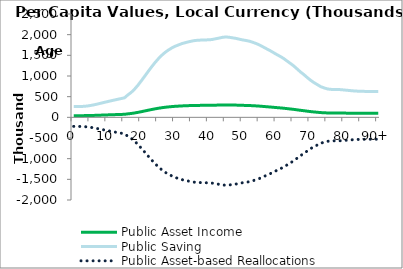
| Category | Public Asset Income | Public Saving | Public Asset-based Reallocations |
|---|---|---|---|
| 0 | 40148.06 | 259153.352 | -219005.292 |
|  | 40381.777 | 260661.978 | -220280.201 |
| 2 | 40615.493 | 262170.604 | -221555.111 |
| 3 | 41235.617 | 266173.47 | -224937.852 |
| 4 | 42460.541 | 274080.281 | -231619.74 |
| 5 | 44397.2 | 286581.298 | -242184.098 |
| 6 | 46856.028 | 302452.888 | -255596.86 |
| 7 | 49771.188 | 321270.069 | -271498.882 |
| 8 | 52848.296 | 341132.62 | -288284.324 |
| 9 | 55918.351 | 360949.647 | -305031.296 |
| 10 | 58954.067 | 380545.015 | -321590.948 |
| 11 | 61922.236 | 399704.368 | -337782.132 |
| 12 | 64754.889 | 417988.976 | -353234.087 |
| 13 | 67562.383 | 436111.181 | -368548.798 |
| 14 | 70315.509 | 453882.452 | -383566.942 |
| 15 | 73070.725 | 471667.203 | -398596.479 |
| 16 | 84000.107 | 542215.717 | -458215.611 |
| 17 | 93523.48 | 603688.526 | -510165.046 |
| 18 | 105770.193 | 682740.338 | -576970.145 |
| 19 | 120614.885 | 778561.942 | -657947.057 |
| 20 | 137241.334 | 885884.685 | -748643.352 |
| 21 | 154357.834 | 996370.68 | -842012.846 |
| 22 | 171777.245 | 1108811.947 | -937034.703 |
| 23 | 188872.63 | 1219161.648 | -1030289.018 |
| 24 | 204813.933 | 1322061.816 | -1117247.883 |
| 25 | 219322.167 | 1415711.604 | -1196389.437 |
| 26 | 232345.533 | 1499776.662 | -1267431.129 |
| 27 | 243353.732 | 1570833.936 | -1327480.204 |
| 28 | 252368.228 | 1629021.975 | -1376653.747 |
| 29 | 260111.034 | 1679001.328 | -1418890.294 |
| 30 | 266577.172 | 1720739.868 | -1454162.696 |
| 31 | 271554.82 | 1752870.29 | -1481315.47 |
| 32 | 276485.14 | 1784695.214 | -1508210.074 |
| 33 | 279922.772 | 1806884.924 | -1526962.152 |
| 34 | 283181.805 | 1827921.789 | -1544739.984 |
| 35 | 286004.624 | 1846142.919 | -1560138.295 |
| 36 | 288264.847 | 1860732.526 | -1572467.679 |
| 37 | 288867.732 | 1864624.113 | -1575756.38 |
| 38 | 290156.22 | 1872941.224 | -1582785.004 |
| 39 | 290201.987 | 1873236.65 | -1583034.663 |
| 40 | 290483.171 | 1875051.674 | -1584568.503 |
| 41 | 291957.975 | 1884571.448 | -1592613.473 |
| 42 | 294555.172 | 1901336.2 | -1606781.028 |
| 43 | 297166.865 | 1918194.524 | -1621027.659 |
| 44 | 299958.656 | 1936215.368 | -1636256.712 |
| 45 | 301211.401 | 1944301.762 | -1643090.361 |
| 46 | 299987.716 | 1936402.948 | -1636415.232 |
| 47 | 297877.32 | 1922780.469 | -1624903.149 |
| 48 | 295743.718 | 1909008.193 | -1613264.475 |
| 49 | 292708.328 | 1889414.929 | -1596706.601 |
| 50 | 289928.137 | 1871468.964 | -1581540.827 |
| 51 | 287818.017 | 1857848.266 | -1570030.248 |
| 52 | 285078.725 | 1840166.292 | -1555087.568 |
| 53 | 280833.163 | 1812761.445 | -1531928.282 |
| 54 | 276148.648 | 1782523.178 | -1506374.53 |
| 55 | 270496.045 | 1746035.959 | -1475539.914 |
| 56 | 263629.844 | 1701715.035 | -1438085.192 |
| 57 | 256795.43 | 1657599.3 | -1400803.87 |
| 58 | 250165.613 | 1614804.226 | -1364638.613 |
| 59 | 242786.792 | 1567174.374 | -1324387.582 |
| 60 | 235327.416 | 1519024.542 | -1283697.126 |
| 61 | 228489.526 | 1474886.368 | -1246396.841 |
| 62 | 220774.696 | 1425087.596 | -1204312.9 |
| 63 | 211464.605 | 1364991.506 | -1153526.901 |
| 64 | 202230.28 | 1305384.484 | -1103154.204 |
| 65 | 192737.193 | 1244107.174 | -1051369.98 |
| 66 | 181473.119 | 1171398.244 | -989925.125 |
| 67 | 170116.912 | 1098094.596 | -927977.684 |
| 68 | 160237.31 | 1034322.352 | -874085.042 |
| 69 | 149213.966 | 963167.316 | -813953.35 |
| 70 | 138848.698 | 896260.124 | -757411.426 |
| 71 | 130151.781 | 840122.044 | -709970.262 |
| 72 | 122483.262 | 790622.207 | -668138.945 |
| 73 | 114873.145 | 741499.348 | -626626.204 |
| 74 | 110298.524 | 711970.444 | -601671.92 |
| 75 | 106260.053 | 685902.354 | -579642.3 |
| 76 | 104842.217 | 676750.303 | -571908.087 |
| 77 | 104012.764 | 671396.234 | -567383.47 |
| 78 | 104240.891 | 672868.781 | -568627.89 |
| 79 | 103724.633 | 669536.365 | -565811.732 |
| 80 | 102320.141 | 660470.456 | -558150.315 |
| 81 | 101145.101 | 652885.64 | -551740.539 |
| 82 | 99879.745 | 644717.84 | -544838.096 |
| 83 | 98750.731 | 637430.126 | -538679.394 |
| 84 | 98035 | 632810.125 | -534775.125 |
| 85 | 97668.27 | 630442.903 | -532774.633 |
| 86 | 97257.417 | 627790.869 | -530533.452 |
| 87 | 97110.397 | 626841.862 | -529731.466 |
| 88 | 97048.402 | 626441.688 | -529393.286 |
| 89 | 97075.1 | 626614.027 | -529538.926 |
| 90+ | 97114.537 | 626868.59 | -529754.053 |